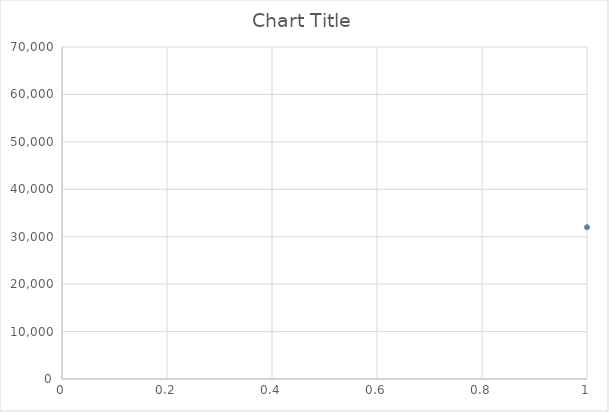
| Category | Series 0 |
|---|---|
| 0 | 32000 |
| 1 | 32200 |
| 2 | 30000 |
| 3 | 32600 |
| 4 | 32800 |
| 5 | 30800 |
| 6 | 41500 |
| 7 | 41000 |
| 8 | 41500 |
| 9 | 41000 |
| 10 | 50500 |
| 11 | 31800 |
| 12 | 31400 |
| 13 | 31000 |
| 14 | 31800 |
| 15 | 42000 |
| 16 | 43500 |
| 17 | 31600 |
| 18 | 31600 |
| 19 | 31000 |
| 20 | 31600 |
| 21 | 31800 |
| 22 | 31400 |
| 23 | 31000 |
| 24 | 31800 |
| 25 | 42500 |
| 26 | 44500 |
| 27 | 42000 |
| 28 | 43500 |
| 29 | 11000 |
| 30 | 13000 |
| 31 | 18000 |
| 32 | 21000 |
| 33 | 8700 |
| 34 | 8700 |
| 35 | 10900 |
| 36 | 10900 |
| 37 | 13600 |
| 38 | 13600 |
| 39 | 18000 |
| 40 | 18540 |
| 41 | 20300 |
| 42 | 20300 |
| 43 | 10900 |
| 44 | 14400 |
| 45 | 18000 |
| 46 | 21600 |
| 47 | 27600 |
| 48 | 22000 |
| 49 | 25000 |
| 50 | 28600 |
| 51 | 45000 |
| 52 | 45000 |
| 53 | 48000 |
| 54 | 66000 |
| 55 | 42000 |
| 56 | 42000 |
| 57 | 42000 |
| 58 | 54000 |
| 59 | 66000 |
| 60 | 26000 |
| 61 | 38000 |
| 62 | 38000 |
| 63 | 38000 |
| 64 | 38000 |
| 65 | 13600 |
| 66 | 21600 |
| 67 | 10000 |
| 68 | 12000 |
| 69 | 9800 |
| 70 | 11800 |
| 71 | 24000 |
| 72 | 9800 |
| 73 | 9800 |
| 74 | 12000 |
| 75 | 18000 |
| 76 | 25000 |
| 77 | 23600 |
| 78 | 24000 |
| 79 | 23800 |
| 80 | 24000 |
| 81 | 24000 |
| 82 | 24000 |
| 83 | 24000 |
| 84 | 23800 |
| 85 | 23800 |
| 86 | 23600 |
| 87 | 23200 |
| 88 | 23200 |
| 89 | 23000 |
| 90 | 22800 |
| 91 | 22800 |
| 92 | 22600 |
| 93 | 24000 |
| 94 | 24000 |
| 95 | 24000 |
| 96 | 24000 |
| 97 | 23400 |
| 98 | 23400 |
| 99 | 23600 |
| 100 | 23400 |
| 101 | 23400 |
| 102 | 23200 |
| 103 | 23200 |
| 104 | 23400 |
| 105 | 24000 |
| 106 | 23800 |
| 107 | 23800 |
| 108 | 23800 |
| 109 | 23800 |
| 110 | 23600 |
| 111 | 23400 |
| 112 | 23400 |
| 113 | 23200 |
| 114 | 23600 |
| 115 | 23400 |
| 116 | 23400 |
| 117 | 23200 |
| 118 | 23000 |
| 119 | 23000 |
| 120 | 23000 |
| 121 | 23000 |
| 122 | 23000 |
| 123 | 23000 |
| 124 | 23000 |
| 125 | 23000 |
| 126 | 22800 |
| 127 | 22800 |
| 128 | 22800 |
| 129 | 22800 |
| 130 | 22800 |
| 131 | 22800 |
| 132 | 23000 |
| 133 | 23000 |
| 134 | 23000 |
| 135 | 23000 |
| 136 | 23000 |
| 137 | 23000 |
| 138 | 23400 |
| 139 | 23400 |
| 140 | 23400 |
| 141 | 23400 |
| 142 | 23200 |
| 143 | 23200 |
| 144 | 23200 |
| 145 | 23000 |
| 146 | 23000 |
| 147 | 23400 |
| 148 | 23200 |
| 149 | 23200 |
| 150 | 23200 |
| 151 | 23200 |
| 152 | 23200 |
| 153 | 23200 |
| 154 | 23200 |
| 155 | 23000 |
| 156 | 23200 |
| 157 | 23000 |
| 158 | 23000 |
| 159 | 23200 |
| 160 | 23200 |
| 161 | 33400 |
| 162 | 35404 |
| 163 | 35738 |
| 164 | 33400 |
| 165 | 35000 |
| 166 | 33600 |
| 167 | 33200 |
| 168 | 33000 |
| 169 | 32800 |
| 170 | 34200 |
| 171 | 34000 |
| 172 | 33600 |
| 173 | 35200 |
| 174 | 34800 |
| 175 | 34600 |
| 176 | 33800 |
| 177 | 33600 |
| 178 | 33800 |
| 179 | 33600 |
| 180 | 33400 |
| 181 | 34000 |
| 182 | 34200 |
| 183 | 34000 |
| 184 | 33800 |
| 185 | 34000 |
| 186 | 34000 |
| 187 | 33800 |
| 188 | 34000 |
| 189 | 34000 |
| 190 | 33600 |
| 191 | 33600 |
| 192 | 33600 |
| 193 | 32800 |
| 194 | 33600 |
| 195 | 33600 |
| 196 | 33200 |
| 197 | 33200 |
| 198 | 33200 |
| 199 | 33200 |
| 200 | 33200 |
| 201 | 33200 |
| 202 | 34200 |
| 203 | 34200 |
| 204 | 33800 |
| 205 | 33800 |
| 206 | 33800 |
| 207 | 34000 |
| 208 | 33800 |
| 209 | 33800 |
| 210 | 33800 |
| 211 | 33800 |
| 212 | 33800 |
| 213 | 34000 |
| 214 | 34000 |
| 215 | 34000 |
| 216 | 34000 |
| 217 | 33800 |
| 218 | 33800 |
| 219 | 33800 |
| 220 | 33800 |
| 221 | 33800 |
| 222 | 33800 |
| 223 | 33800 |
| 224 | 45500 |
| 225 | 46500 |
| 226 | 46000 |
| 227 | 45500 |
| 228 | 45500 |
| 229 | 46000 |
| 230 | 46000 |
| 231 | 46000 |
| 232 | 55500 |
| 233 | 10000 |
| 234 | 12000 |
| 235 | 55500 |
| 236 | 33400 |
| 237 | 45500 |
| 238 | 23600 |
| 239 | 24000 |
| 240 | 11800 |
| 241 | 10900 |
| 242 | 18000 |
| 243 | 18000 |
| 244 | 18000 |
| 245 | 19000 |
| 246 | 19000 |
| 247 | 36000 |
| 248 | 36000 |
| 249 | 48000 |
| 250 | 48000 |
| 251 | 23000 |
| 252 | 23000 |
| 253 | 28000 |
| 254 | 28000 |
| 255 | 23600 |
| 256 | 24000 |
| 257 | 23800 |
| 258 | 24000 |
| 259 | 24000 |
| 260 | 24000 |
| 261 | 24000 |
| 262 | 23800 |
| 263 | 23800 |
| 264 | 23600 |
| 265 | 23200 |
| 266 | 23200 |
| 267 | 23000 |
| 268 | 22800 |
| 269 | 22800 |
| 270 | 22600 |
| 271 | 24000 |
| 272 | 24000 |
| 273 | 24000 |
| 274 | 24000 |
| 275 | 23400 |
| 276 | 23400 |
| 277 | 23600 |
| 278 | 23400 |
| 279 | 23400 |
| 280 | 23200 |
| 281 | 23200 |
| 282 | 23400 |
| 283 | 24000 |
| 284 | 23800 |
| 285 | 23800 |
| 286 | 23800 |
| 287 | 23800 |
| 288 | 23600 |
| 289 | 23400 |
| 290 | 23400 |
| 291 | 23200 |
| 292 | 23600 |
| 293 | 23400 |
| 294 | 23400 |
| 295 | 23200 |
| 296 | 23000 |
| 297 | 23000 |
| 298 | 23000 |
| 299 | 23000 |
| 300 | 23000 |
| 301 | 23000 |
| 302 | 23000 |
| 303 | 23000 |
| 304 | 22800 |
| 305 | 22800 |
| 306 | 22800 |
| 307 | 22800 |
| 308 | 22800 |
| 309 | 22800 |
| 310 | 23000 |
| 311 | 23000 |
| 312 | 23000 |
| 313 | 23000 |
| 314 | 23000 |
| 315 | 23000 |
| 316 | 23400 |
| 317 | 23400 |
| 318 | 23400 |
| 319 | 23400 |
| 320 | 23200 |
| 321 | 23200 |
| 322 | 23200 |
| 323 | 23000 |
| 324 | 23000 |
| 325 | 23400 |
| 326 | 23200 |
| 327 | 23200 |
| 328 | 23200 |
| 329 | 23200 |
| 330 | 23200 |
| 331 | 23200 |
| 332 | 23200 |
| 333 | 23000 |
| 334 | 23200 |
| 335 | 23000 |
| 336 | 23000 |
| 337 | 23200 |
| 338 | 23200 |
| 339 | 23200 |
| 340 | 33400 |
| 341 | 35404 |
| 342 | 35738 |
| 343 | 33400 |
| 344 | 35000 |
| 345 | 33600 |
| 346 | 33200 |
| 347 | 33000 |
| 348 | 32800 |
| 349 | 34200 |
| 350 | 34000 |
| 351 | 33600 |
| 352 | 35200 |
| 353 | 34800 |
| 354 | 34600 |
| 355 | 33800 |
| 356 | 33600 |
| 357 | 33800 |
| 358 | 33600 |
| 359 | 33400 |
| 360 | 34000 |
| 361 | 34200 |
| 362 | 34000 |
| 363 | 33800 |
| 364 | 34000 |
| 365 | 34000 |
| 366 | 33800 |
| 367 | 34000 |
| 368 | 34000 |
| 369 | 33600 |
| 370 | 33600 |
| 371 | 33600 |
| 372 | 32800 |
| 373 | 33600 |
| 374 | 33600 |
| 375 | 33200 |
| 376 | 33200 |
| 377 | 33200 |
| 378 | 33200 |
| 379 | 33200 |
| 380 | 33200 |
| 381 | 34200 |
| 382 | 34200 |
| 383 | 33800 |
| 384 | 33800 |
| 385 | 33800 |
| 386 | 34000 |
| 387 | 33800 |
| 388 | 33800 |
| 389 | 33800 |
| 390 | 33800 |
| 391 | 33800 |
| 392 | 34000 |
| 393 | 34000 |
| 394 | 34000 |
| 395 | 34000 |
| 396 | 33800 |
| 397 | 33800 |
| 398 | 33800 |
| 399 | 33800 |
| 400 | 33800 |
| 401 | 33800 |
| 402 | 33800 |
| 403 | 45500 |
| 404 | 46500 |
| 405 | 46000 |
| 406 | 45500 |
| 407 | 45500 |
| 408 | 46000 |
| 409 | 46000 |
| 410 | 46000 |
| 411 | 55500 |
| 412 | 12000 |
| 413 | 12000 |
| 414 | 12000 |
| 415 | 12000 |
| 416 | 19000 |
| 417 | 19000 |
| 418 | 19000 |
| 419 | 19000 |
| 420 | 0 |
| 421 | 0 |
| 422 | 0 |
| 423 | 0 |
| 424 | 24000 |
| 425 | 24000 |
| 426 | 24000 |
| 427 | 24000 |
| 428 | 18000 |
| 429 | 18000 |
| 430 | 18000 |
| 431 | 18000 |
| 432 | 10000 |
| 433 | 12000 |
| 434 | 9000 |
| 435 | 13000 |
| 436 | 19000 |
| 437 | 10900 |
| 438 | 11800 |
| 439 | 24000 |
| 440 | 18000 |
| 441 | 10000 |
| 442 | 12000 |
| 443 | 9800 |
| 444 | 11800 |
| 445 | 24000 |
| 446 | 21600 |
| 447 | 16200 |
| 448 | 10000 |
| 449 | 13500 |
| 450 | 24000 |
| 451 | 21600 |
| 452 | 24000 |
| 453 | 24000 |
| 454 | 18000 |
| 455 | 12000 |
| 456 | 16000 |
| 457 | 18000 |
| 458 | 12000 |
| 459 | 14400 |
| 460 | 18000 |
| 461 | 21600 |
| 462 | 25400 |
| 463 | 18900 |
| 464 | 24000 |
| 465 | 18295 |
| 466 | 18056 |
| 467 | 13679 |
| 468 | 10089 |
| 469 | 10942 |
| 470 | 18940 |
| 471 | 24000 |
| 472 | 10000 |
| 473 | 13500 |
| 474 | 16200 |
| 475 | 21600 |
| 476 | 23600 |
| 477 | 35000 |
| 478 | 45500 |
| 479 | 50000 |
| 480 | 23400 |
| 481 | 10000 |
| 482 | 12000 |
| 483 | 9800 |
| 484 | 11800 |
| 485 | 24000 |
| 486 | 9800 |
| 487 | 11800 |
| 488 | 18000 |
| 489 | 25000 |
| 490 | 11000 |
| 491 | 13000 |
| 492 | 8806.37 |